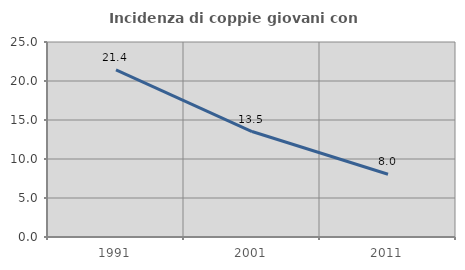
| Category | Incidenza di coppie giovani con figli |
|---|---|
| 1991.0 | 21.413 |
| 2001.0 | 13.519 |
| 2011.0 | 8.049 |